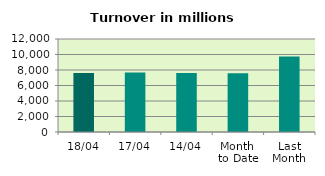
| Category | Series 0 |
|---|---|
| 18/04 | 7619.245 |
| 17/04 | 7691.011 |
| 14/04 | 7603.642 |
| Month 
to Date | 7585.689 |
| Last
Month | 9734.736 |